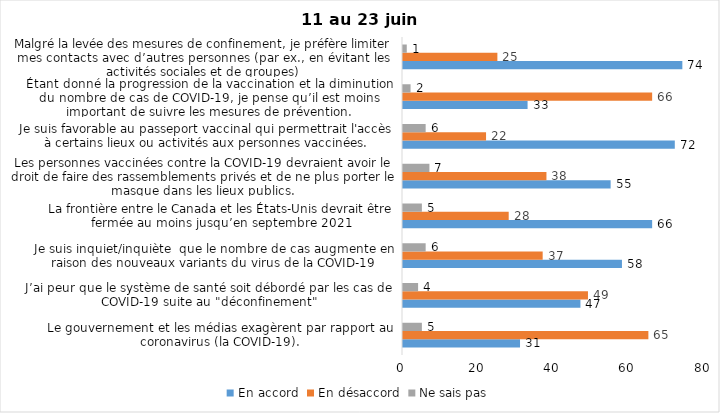
| Category | En accord | En désaccord | Ne sais pas |
|---|---|---|---|
| Le gouvernement et les médias exagèrent par rapport au coronavirus (la COVID-19). | 31 | 65 | 5 |
| J’ai peur que le système de santé soit débordé par les cas de COVID-19 suite au "déconfinement" | 47 | 49 | 4 |
| Je suis inquiet/inquiète  que le nombre de cas augmente en raison des nouveaux variants du virus de la COVID-19 | 58 | 37 | 6 |
| La frontière entre le Canada et les États-Unis devrait être fermée au moins jusqu’en septembre 2021 | 66 | 28 | 5 |
| Les personnes vaccinées contre la COVID-19 devraient avoir le droit de faire des rassemblements privés et de ne plus porter le masque dans les lieux publics. | 55 | 38 | 7 |
| Je suis favorable au passeport vaccinal qui permettrait l'accès à certains lieux ou activités aux personnes vaccinées. | 72 | 22 | 6 |
| Étant donné la progression de la vaccination et la diminution du nombre de cas de COVID-19, je pense qu’il est moins important de suivre les mesures de prévention. | 33 | 66 | 2 |
| Malgré la levée des mesures de confinement, je préfère limiter mes contacts avec d’autres personnes (par ex., en évitant les activités sociales et de groupes) | 74 | 25 | 1 |